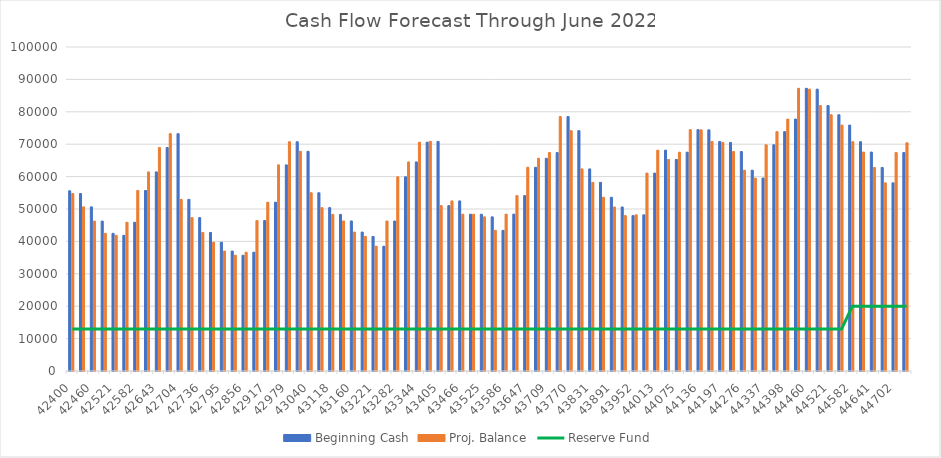
| Category | Beginning Cash | Proj. Balance |
|---|---|---|
| 42400.0 | 55621.26 | 54769.62 |
| 42428.0 | 54769.62 | 50656 |
| 42460.0 | 50656 | 46266.52 |
| 42490.0 | 46266.52 | 42487 |
| 42521.0 | 42487 | 41877 |
| 42551.0 | 41877 | 45904 |
| 42582.0 | 45904 | 55716 |
| 42613.0 | 55716 | 61446.91 |
| 42643.0 | 61446.91 | 68968 |
| 42674.0 | 68968 | 73241 |
| 42704.0 | 73241 | 52964.7 |
| 42705.0 | 52964.7 | 47341.47 |
| 42736.0 | 47341.47 | 42749.45 |
| 42767.0 | 42749.45 | 39736.78 |
| 42795.0 | 39736.78 | 37017.7 |
| 42826.0 | 37017.7 | 35720.92 |
| 42856.0 | 35720.92 | 36659.01 |
| 42887.0 | 36659.01 | 46429.73 |
| 42917.0 | 46429.73 | 52102.19 |
| 42948.0 | 52102.19 | 63613.38 |
| 42979.0 | 63613.38 | 70753.57 |
| 43009.0 | 70753.57 | 67800.19 |
| 43040.0 | 67800.19 | 55008.48 |
| 43070.0 | 55008.48 | 50422.9 |
| 43118.0 | 50422.9 | 48323.9 |
| 43149.0 | 48323.9 | 46308.67 |
| 43160.0 | 46308.67 | 42882.33 |
| 43191.0 | 42882.33 | 41522.84 |
| 43221.0 | 41522.84 | 38510.69 |
| 43252.0 | 38510.69 | 46292.8 |
| 43282.0 | 46292.8 | 59937.95 |
| 43313.0 | 59937.95 | 64527.47 |
| 43344.0 | 64527.47 | 70617 |
| 43374.0 | 70617 | 70867.09 |
| 43405.0 | 70867.09 | 51038.62 |
| 43435.0 | 51038.62 | 52496.11 |
| 43466.0 | 52496.11 | 48384.7 |
| 43497.0 | 48384.7 | 48370.56 |
| 43525.0 | 48370.56 | 47574.22 |
| 43556.0 | 47574.22 | 43411.19 |
| 43586.0 | 43411.19 | 48409.26 |
| 43617.0 | 48409.26 | 54132.88 |
| 43647.0 | 54132.88 | 62873.17 |
| 43678.0 | 62873.17 | 65640.16 |
| 43709.0 | 65640.16 | 67418.79 |
| 43739.0 | 67418.79 | 78527.86 |
| 43770.0 | 78527.86 | 74176.39 |
| 43800.0 | 74176.39 | 62370.61 |
| 43831.0 | 62370.61 | 58226.82 |
| 43862.0 | 58226.82 | 53619.22 |
| 43891.0 | 53619.22 | 50620.11 |
| 43922.0 | 50620.11 | 47945.89 |
| 43952.0 | 47945.89 | 48192.62 |
| 43983.0 | 48192.62 | 61082.25 |
| 44013.0 | 61082.25 | 68155.56 |
| 44044.0 | 68155.56 | 65293.29 |
| 44075.0 | 65293.29 | 67527.38 |
| 44105.0 | 67527.38 | 74493.79 |
| 44136.0 | 74493.79 | 74425.4 |
| 44166.0 | 74425.4 | 70837.56 |
| 44197.0 | 70837.56 | 70557.78 |
| 44228.0 | 70557.78 | 67728.94 |
| 44276.0 | 67728.94 | 61977.57 |
| 44307.0 | 61977.57 | 59550.07 |
| 44337.0 | 59550.07 | 69818.23 |
| 44368.0 | 69818.23 | 73869.56 |
| 44398.0 | 73869.56 | 77756.07 |
| 44429.0 | 77756.07 | 87247.52 |
| 44460.0 | 87247.52 | 86985.19 |
| 44490.0 | 86985.19 | 81917.02 |
| 44521.0 | 81917.02 | 79086.2 |
| 44551.0 | 79086.2 | 75895.87 |
| 44582.0 | 75895.87 | 70768.32 |
| 44613.0 | 70768.32 | 67575.89 |
| 44641.0 | 67575.89 | 62809.15 |
| 44672.0 | 62809.15 | 58067.17 |
| 44702.0 | 58067.17 | 67422.67 |
| 44733.0 | 67422.67 | 70438.48 |